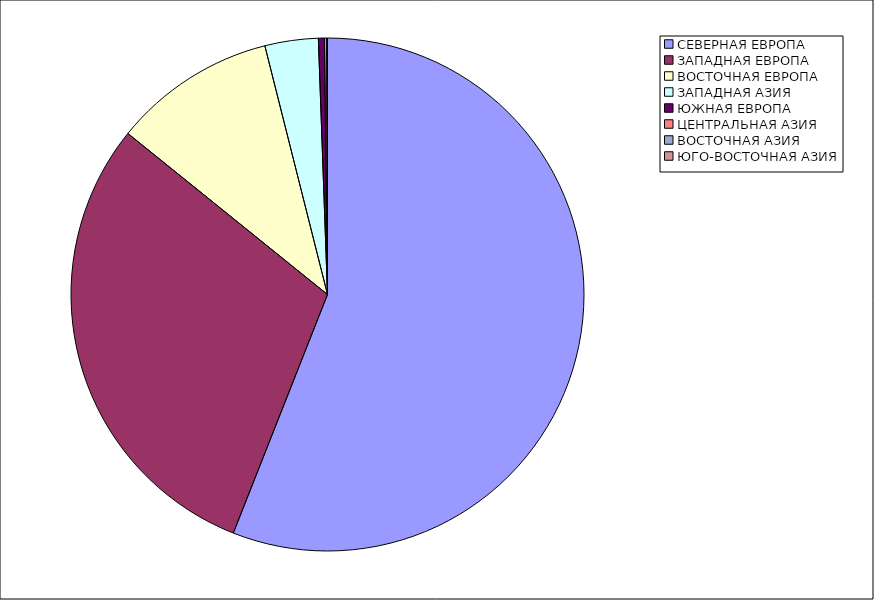
| Category | Оборот |
|---|---|
| СЕВЕРНАЯ ЕВРОПА | 55.985 |
| ЗАПАДНАЯ ЕВРОПА | 29.818 |
| ВОСТОЧНАЯ ЕВРОПА | 10.269 |
| ЗАПАДНАЯ АЗИЯ | 3.361 |
| ЮЖНАЯ ЕВРОПА | 0.376 |
| ЦЕНТРАЛЬНАЯ АЗИЯ | 0.152 |
| ВОСТОЧНАЯ АЗИЯ | 0.02 |
| ЮГО-ВОСТОЧНАЯ АЗИЯ | 0.02 |